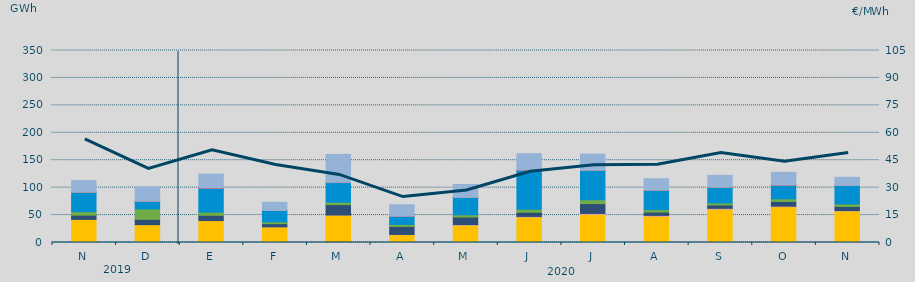
| Category | Carbón | Ciclo Combinado | Cogeneración | Consumo Bombeo | Eólica | Hidráulica | Nuclear | Otras Renovables | Solar fotovoltaica | Solar térmica | Turbinación bombeo |
|---|---|---|---|---|---|---|---|---|---|---|---|
| N | 1857.3 | 40203.9 | 0 | 7774.6 | 6415.7 | 35320.4 | 90 | 0 | 4.8 | 0 | 21237.9 |
| D | 554 | 31978.8 | 44.6 | 9751.3 | 18898.5 | 13540.8 | 366.6 | 0 | 2.1 | 0 | 26259.7 |
| E | 1376.4 | 38547.2 | 103.6 | 9542.6 | 5736.2 | 43797.8 | 0.3 | 0 | 1.3 | 1 | 25589.5 |
| F | 1350.5 | 27202.4 | 33.6 | 5812.5 | 3281.1 | 20532.5 | 140 | 103.7 | 7.4 | 0 | 14830 |
| M | 2245.9 | 47824.7 | 73.5 | 18946.1 | 4359.7 | 35788.8 | 0 | 674.6 | 8.2 | 0 | 50742.6 |
| A | 0 | 14386.3 | 255.3 | 14671.4 | 3599.9 | 14970.4 | 0 | 474.6 | 1.7 | 0 | 20437.2 |
| M | 0 | 31710.8 | 991.1 | 13782.9 | 4057.5 | 31461.1 | 16.4 | 257 | 5.9 | 0 | 23468.1 |
| J | 82.3 | 46358.8 | 1092.1 | 7553.9 | 5342.6 | 71363.3 | 488.9 | 0.6 | 15.1 | 0 | 29619.5 |
| J | 41 | 51366.4 | 1567 | 17926.2 | 6971.2 | 53578.6 | 144 | 24.9 | 30.8 | 0 | 29400.3 |
| A | 6.7 | 48088.1 | 1369.2 | 5986.6 | 4572.9 | 35455.6 | 0 | 107.3 | 13.8 | 0 | 20673.5 |
| S | 54.7 | 60777.7 | 1507.9 | 6085.9 | 3725.9 | 28681.9 | 75 | 8 | 25.7 | 0 | 21527.4 |
| O | 27.3 | 65427.4 | 840.9 | 8534.6 | 4755.7 | 24804.7 | 0 | 0 | 8 | 2.5 | 23457.4 |
| N | 575.3 | 57009.7 | 618 | 7516.8 | 4494.6 | 33922.4 | 5.6 | 0.3 | 7.2 | 0 | 14589.5 |